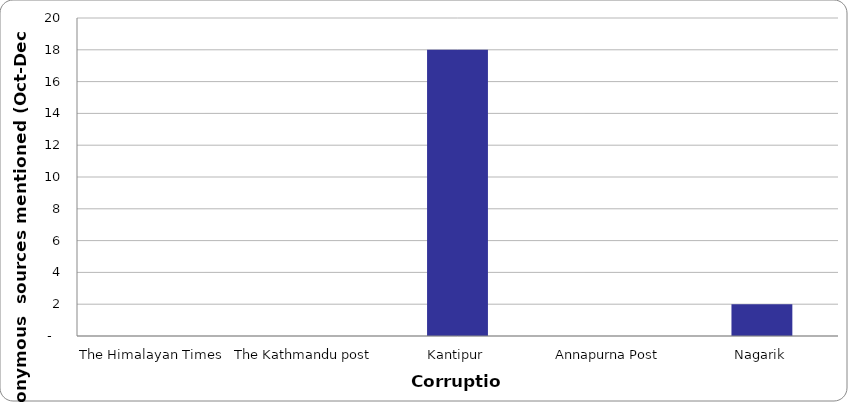
| Category | Corruption |
|---|---|
| The Himalayan Times | 0 |
| The Kathmandu post | 0 |
| Kantipur | 18 |
| Annapurna Post | 0 |
| Nagarik | 2 |